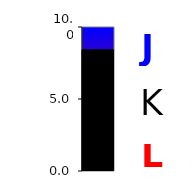
| Category | Series 0 |
|---|---|
| 0 | 8.417 |